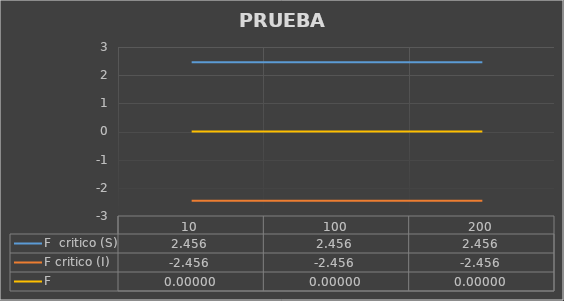
| Category | F  critico (S) | F critico (I) | F |
|---|---|---|---|
| 10.0 | 2.456 | -2.456 | 0 |
| 100.0 | 2.456 | -2.456 | 0 |
| 200.0 | 2.456 | -2.456 | 0 |